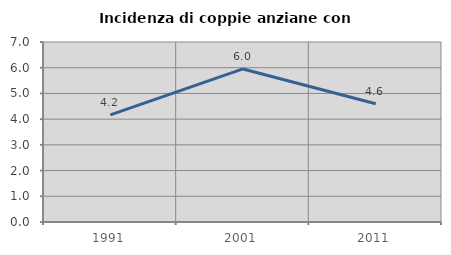
| Category | Incidenza di coppie anziane con figli |
|---|---|
| 1991.0 | 4.167 |
| 2001.0 | 5.952 |
| 2011.0 | 4.598 |